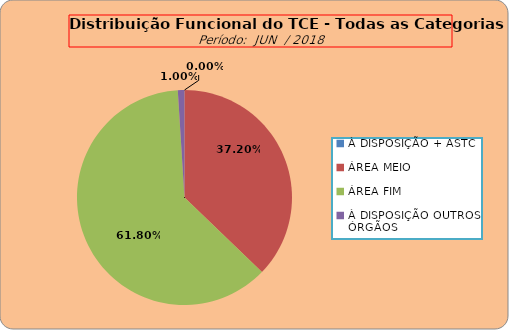
| Category | Series 0 |
|---|---|
| À DISPOSIÇÃO + ASTC | 0 |
| ÁREA MEIO | 186 |
| ÁREA FIM | 309 |
| À DISPOSIÇÃO OUTROS ÓRGÃOS | 5 |